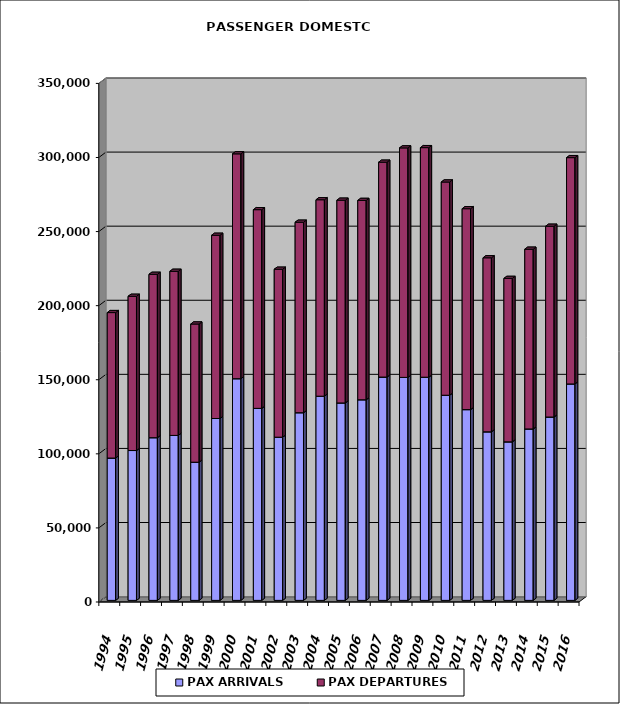
| Category | PAX ARRIVALS | PAX DEPARTURES |
|---|---|---|
| 1994.0 | 96070 | 98165 |
| 1995.0 | 101139 | 104086 |
| 1996.0 | 109810 | 110256 |
| 1997.0 | 111334 | 110761 |
| 1998.0 | 93263 | 93251 |
| 1999.0 | 122752 | 123655 |
| 2000.0 | 149610 | 151755 |
| 2001.0 | 129584 | 134108 |
| 2002.0 | 110141 | 113352 |
| 2003.0 | 126658 | 128561 |
| 2004.0 | 137800 | 132586 |
| 2005.0 | 133256 | 136822 |
| 2006.0 | 135395 | 134532 |
| 2007.0 | 150726 | 145000 |
| 2008.0 | 150484 | 154894 |
| 2009.0 | 150627 | 154927 |
| 2010.0 | 138453 | 143909 |
| 2011.0 | 128746 | 135592 |
| 2012.0 | 113755 | 117460 |
| 2013.0 | 106993 | 110306 |
| 2014.0 | 115701 | 121294 |
| 2015.0 | 123753 | 128753 |
| 2016.0 | 146086 | 152724 |